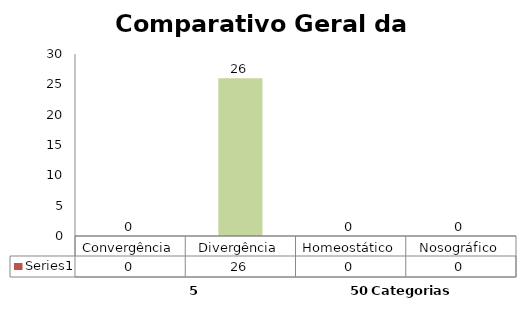
| Category | Series 0 |
|---|---|
| Convergência | 0 |
| Divergência | 26 |
| Homeostático | 0 |
| Nosográfico | 0 |